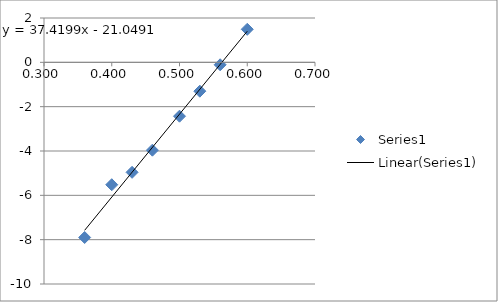
| Category | Series 0 |
|---|---|
| 0.36 | -7.902 |
| 0.4 | -5.521 |
| 0.43 | -4.962 |
| 0.46 | -3.963 |
| 0.5 | -2.43 |
| 0.53 | -1.302 |
| 0.56 | -0.11 |
| 0.6 | 1.491 |